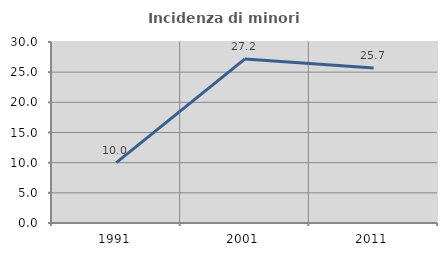
| Category | Incidenza di minori stranieri |
|---|---|
| 1991.0 | 10 |
| 2001.0 | 27.2 |
| 2011.0 | 25.691 |